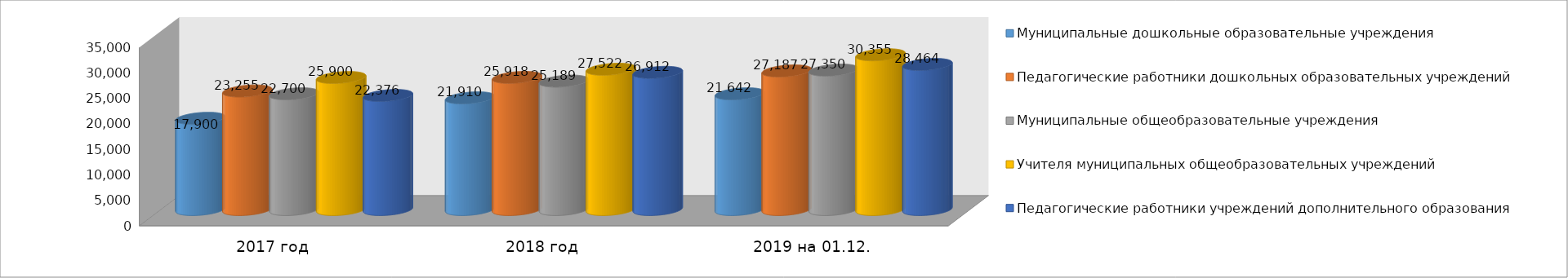
| Category | Муниципальные дошкольные образовательные учреждения | Педагогические работники дошкольных образовательных учреждений | Муниципальные общеобразовательные учреждения | Учителя муниципальных общеобразовательных учреждений | Педагогические работники учреждений дополнительного образования |
|---|---|---|---|---|---|
| 2017 год | 17900 | 23255 | 22700 | 25900 | 22376 |
| 2018 год | 21910 | 25918 | 25189 | 27522 | 26912 |
| 2019 на 01.12. | 22702 | 27187 | 27350 | 30355 | 28464 |